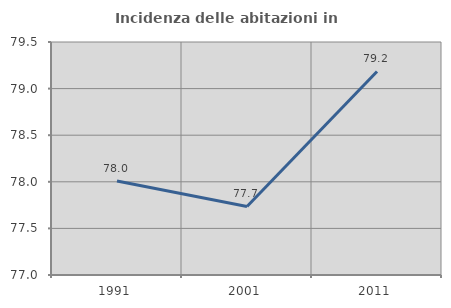
| Category | Incidenza delle abitazioni in proprietà  |
|---|---|
| 1991.0 | 78.008 |
| 2001.0 | 77.736 |
| 2011.0 | 79.184 |